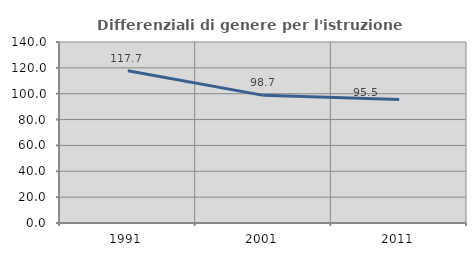
| Category | Differenziali di genere per l'istruzione superiore |
|---|---|
| 1991.0 | 117.733 |
| 2001.0 | 98.726 |
| 2011.0 | 95.493 |